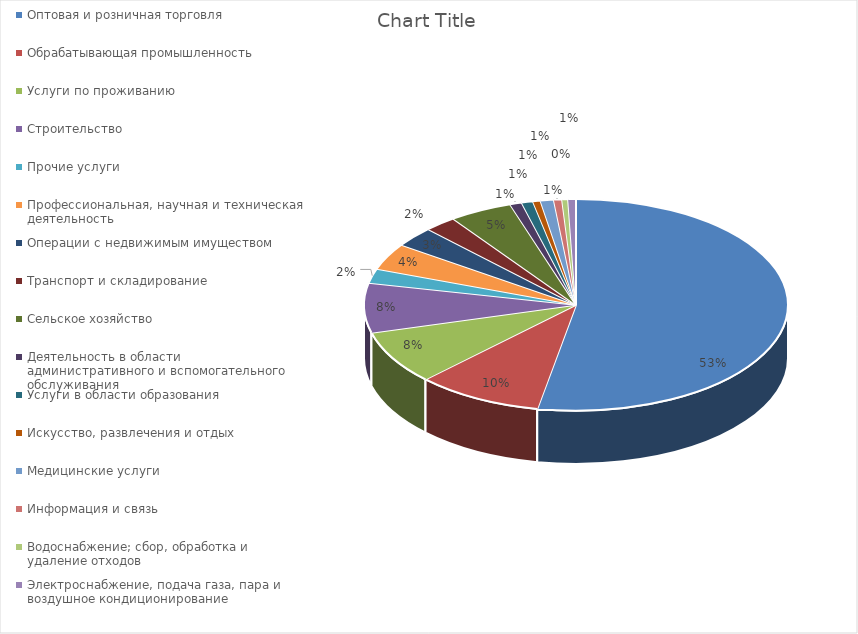
| Category | Series 0 |
|---|---|
| Оптовая и розничная торговля | 0.529 |
| Обрабатывающая промышленность | 0.096 |
| Услуги по проживанию | 0.082 |
| Строительство | 0.076 |
| Прочие услуги | 0.022 |
| Профессиональная, научная и техническая деятельность | 0.04 |
| Операции с недвижимым имуществом | 0.031 |
| Транспорт и складирование | 0.025 |
| Сельское хозяйство | 0.048 |
| Деятельность в области административного и вспомогательного обслуживания | 0.009 |
| Услуги в области образования | 0.009 |
| Искусство, развлечения и отдых | 0.006 |
| Медицинские услуги | 0.01 |
| Информация и связь | 0.006 |
| Водоснабжение; сбор, обработка и удаление отходов | 0.005 |
| Электроснабжение, подача газа, пара и воздушное кондиционирование | 0.006 |